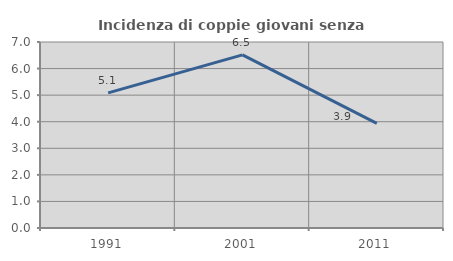
| Category | Incidenza di coppie giovani senza figli |
|---|---|
| 1991.0 | 5.083 |
| 2001.0 | 6.515 |
| 2011.0 | 3.937 |